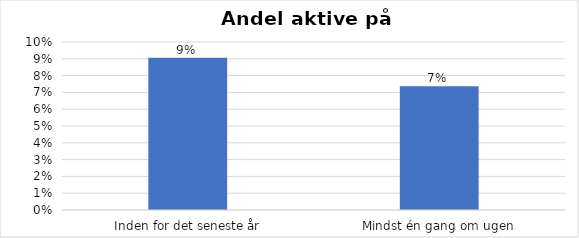
| Category | % |
|---|---|
| Inden for det seneste år | 0.091 |
| Mindst én gang om ugen | 0.074 |